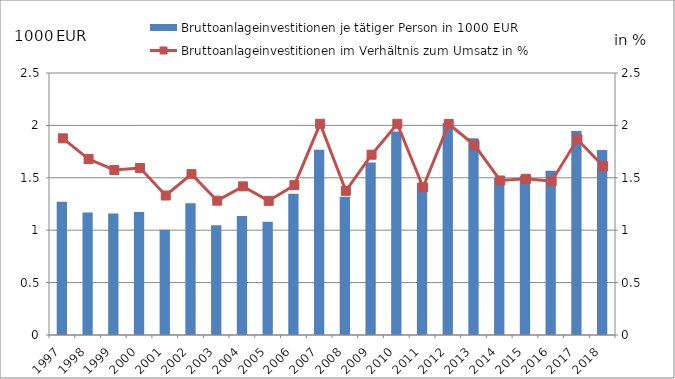
| Category | Bruttoanlageinvestitionen je tätiger Person in 1000 EUR |
|---|---|
| 1997.0 | 1.272 |
| 1998.0 | 1.17 |
| 1999.0 | 1.16 |
| 2000.0 | 1.174 |
| 2001.0 | 1.005 |
| 2002.0 | 1.257 |
| 2003.0 | 1.048 |
| 2004.0 | 1.134 |
| 2005.0 | 1.08 |
| 2006.0 | 1.348 |
| 2007.0 | 1.767 |
| 2008.0 | 1.32 |
| 2009.0 | 1.647 |
| 2010.0 | 1.942 |
| 2011.0 | 1.451 |
| 2012.0 | 2.026 |
| 2013.0 | 1.878 |
| 2014.0 | 1.499 |
| 2015.0 | 1.521 |
| 2016.0 | 1.568 |
| 2017.0 | 1.948 |
| 2018.0 | 1.765 |